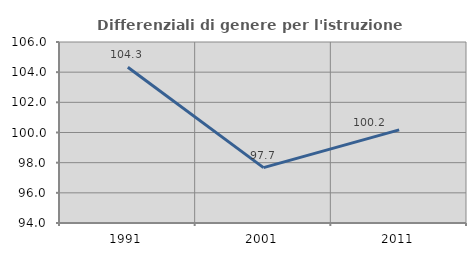
| Category | Differenziali di genere per l'istruzione superiore |
|---|---|
| 1991.0 | 104.321 |
| 2001.0 | 97.671 |
| 2011.0 | 100.177 |